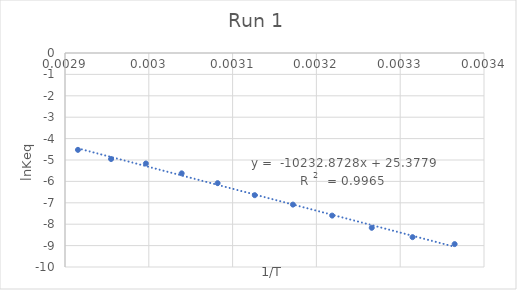
| Category | Series 0 |
|---|---|
| 0.003364963994885255 | -8.93 |
| 0.003314770617873243 | -8.605 |
| 0.0032660526487686982 | -8.168 |
| 0.0032188495831589788 | -7.598 |
| 0.003171985028230667 | -7.084 |
| 0.0031264655307175235 | -6.644 |
| 0.0030821390044691015 | -6.082 |
| 0.0030392365437802026 | -5.624 |
| 0.002996524032122737 | -5.164 |
| 0.002954995419757099 | -4.954 |
| 0.0029154518950437317 | -4.526 |